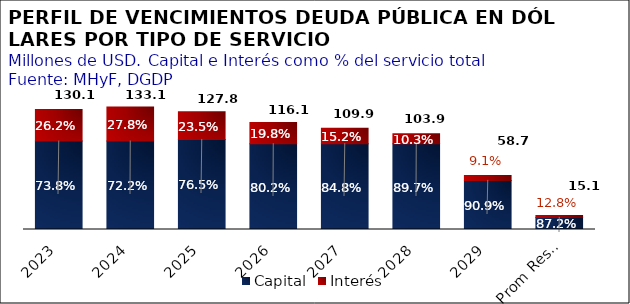
| Category | Capital | Interés |
|---|---|---|
| 2023 | 96.005 | 34.139 |
| 2024 | 96.038 | 37.029 |
| 2025 | 97.752 | 30.023 |
| 2026 | 93.149 | 22.984 |
| 2027 | 93.149 | 16.71 |
| 2028 | 93.15 | 10.721 |
| 2029 | 53.302 | 5.352 |
| Prom Resto 2030-2050 | 13.155 | 1.936 |